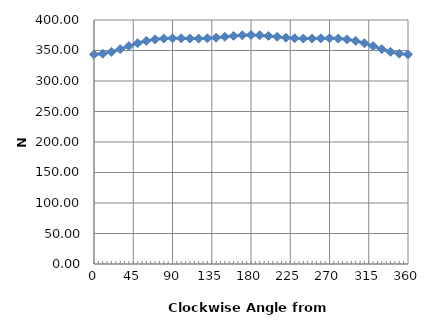
| Category | Series 0 |
|---|---|
| 0.0 | 343.675 |
| 10.0 | 344.755 |
| 20.0 | 347.788 |
| 30.0 | 352.205 |
| 40.0 | 357.215 |
| 50.0 | 361.98 |
| 60.0 | 365.791 |
| 70.0 | 368.303 |
| 80.0 | 369.575 |
| 90.0 | 370.009 |
| 100.0 | 369.933 |
| 110.0 | 369.631 |
| 120.0 | 369.559 |
| 130.0 | 370.002 |
| 140.0 | 371.012 |
| 150.0 | 372.436 |
| 160.0 | 373.909 |
| 170.0 | 375.012 |
| 180.0 | 375.42 |
| 190.0 | 375.012 |
| 200.0 | 373.909 |
| 210.0 | 372.436 |
| 220.0 | 371.012 |
| 230.0 | 370.002 |
| 240.0 | 369.559 |
| 250.0 | 369.631 |
| 260.0 | 369.933 |
| 270.0 | 370.009 |
| 280.0 | 369.575 |
| 290.0 | 368.303 |
| 300.0 | 365.791 |
| 310.0 | 361.98 |
| 320.0 | 357.215 |
| 330.0 | 352.205 |
| 340.0 | 347.788 |
| 350.0 | 344.755 |
| 360.0 | 343.675 |